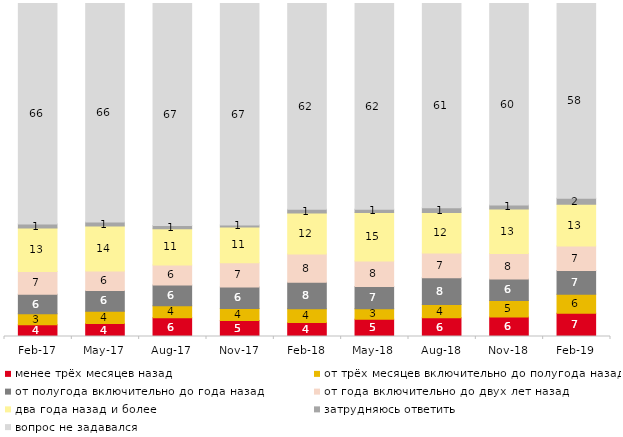
| Category | менее трёх месяцев назад | от трёх месяцев включительно до полугода назад | от полугода включительно до года назад | от года включительно до двух лет назад | два года назад и более | затрудняюсь ответить | вопрос не задавался |
|---|---|---|---|---|---|---|---|
| 2017-02-01 | 3.55 | 3.25 | 5.9 | 6.8 | 13.1 | 1.15 | 66.25 |
| 2017-05-01 | 3.9 | 3.65 | 6.3 | 5.8 | 13.5 | 1.25 | 65.6 |
| 2017-08-01 | 5.65 | 3.6 | 6.25 | 6 | 10.85 | 0.95 | 66.7 |
| 2017-11-01 | 4.8 | 3.6 | 6.45 | 7.3 | 10.75 | 0.6 | 66.5 |
| 2018-02-01 | 4.2 | 4.1 | 8 | 8.45 | 12.35 | 1.1 | 61.8 |
| 2018-05-01 | 5.2 | 3.15 | 6.65 | 7.7 | 14.5 | 1 | 61.8 |
| 2018-08-01 | 5.6 | 4 | 8.05 | 7.45 | 12.15 | 1.45 | 61.3 |
| 2018-11-01 | 5.888 | 4.94 | 6.437 | 7.635 | 13.373 | 1.248 | 60.479 |
| 2019-02-01 | 6.95 | 5.75 | 7.15 | 7.35 | 12.5 | 1.85 | 58.45 |